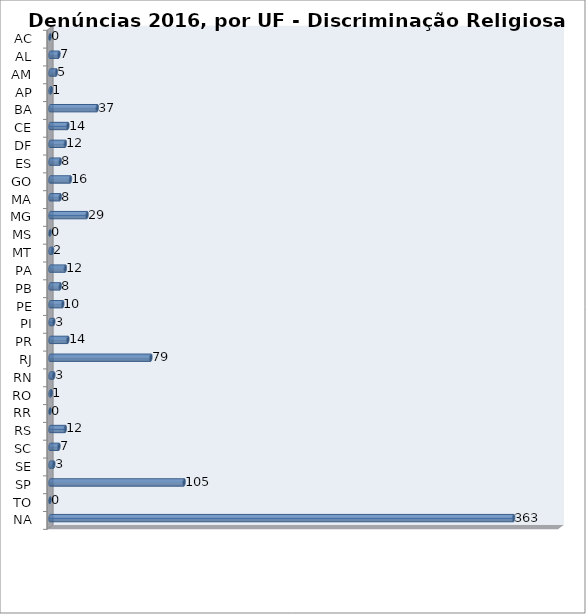
| Category | Series 0 |
|---|---|
| AC | 0 |
| AL | 7 |
| AM | 5 |
| AP | 1 |
| BA | 37 |
| CE | 14 |
| DF | 12 |
| ES | 8 |
| GO | 16 |
| MA | 8 |
| MG | 29 |
| MS | 0 |
| MT | 2 |
| PA | 12 |
| PB | 8 |
| PE | 10 |
| PI | 3 |
| PR | 14 |
| RJ | 79 |
| RN | 3 |
| RO | 1 |
| RR | 0 |
| RS | 12 |
| SC | 7 |
| SE | 3 |
| SP | 105 |
| TO | 0 |
| NA | 363 |